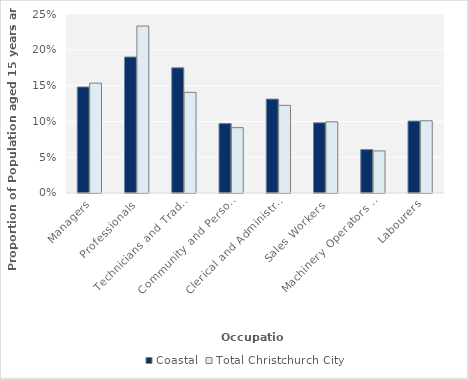
| Category | Coastal | Total Christchurch City |
|---|---|---|
| Managers | 0.148 | 0.153 |
| Professionals | 0.19 | 0.233 |
| Technicians and Trades Workers | 0.175 | 0.141 |
| Community and Personal Service Workers | 0.097 | 0.091 |
| Clerical and Administrative Workers | 0.131 | 0.122 |
| Sales Workers | 0.098 | 0.099 |
| Machinery Operators and Drivers | 0.061 | 0.059 |
| Labourers | 0.1 | 0.101 |